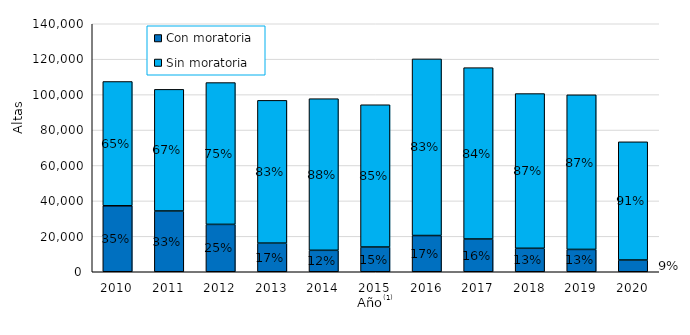
| Category | Con moratoria | Sin moratoria |
|---|---|---|
| 2010.0 | 37246 | 70158 |
| 2011.0 | 34301 | 68663 |
| 2012.0 | 26736 | 80055 |
| 2013.0 | 16157 | 80596 |
| 2014.0 | 12109 | 85592 |
| 2015.0 | 13961 | 80314 |
| 2016.0 | 20454 | 99705 |
| 2017.0 | 18480 | 96741 |
| 2018.0 | 13243 | 87344 |
| 2019.0 | 12609 | 87292 |
| 2020.0 | 6633 | 66723 |